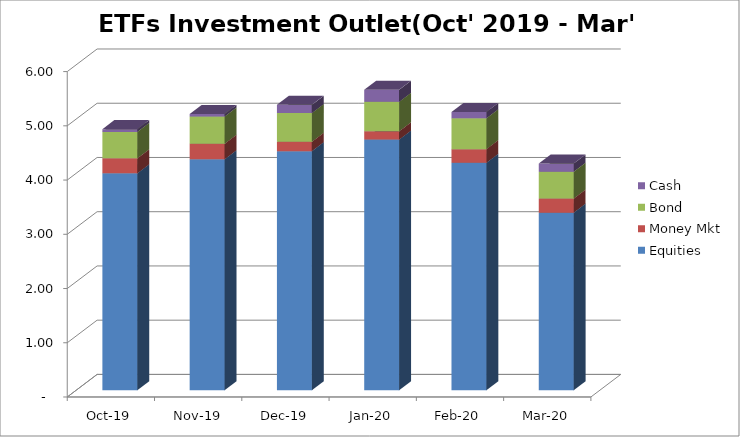
| Category | Equities | Money Mkt | Bond | Cash |
|---|---|---|---|---|
| 2019-10-01 | 3998481766.57 | 276775288.51 | 488154889.65 | 50379881.56 |
| 2019-11-01 | 4258053610.08 | 285466996.9 | 503321320.85 | 44585809.67 |
| 2019-12-01 | 4408225444.33 | 171857896.38 | 529473292.36 | 151803547.97 |
| 2020-01-01 | 4620730446.19 | 152280847.14 | 544105837.98 | 221324761.76 |
| 2020-02-01 | 4193271504.52 | 252081379.79 | 568973079.15 | 116675921.8 |
| 2020-03-01 | 3274342665.32 | 259460908.27 | 495910824.65 | 150095912.89 |